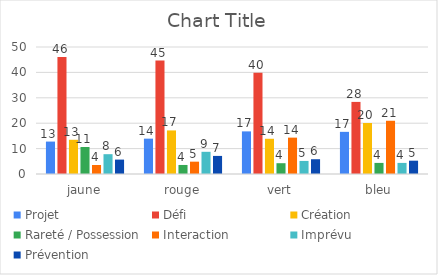
| Category | Projet | Défi | Création | Rareté / Possession | Interaction | Imprévu | Prévention |
|---|---|---|---|---|---|---|---|
| jaune | 12.766 | 46.099 | 13.475 | 10.638 | 3.546 | 7.801 | 5.674 |
| rouge | 13.916 | 44.66 | 17.152 | 3.56 | 4.854 | 8.738 | 7.12 |
| vert | 16.779 | 39.821 | 13.87 | 4.251 | 14.318 | 5.145 | 5.817 |
| bleu | 16.594 | 28.384 | 20.087 | 4.367 | 20.961 | 4.367 | 5.24 |